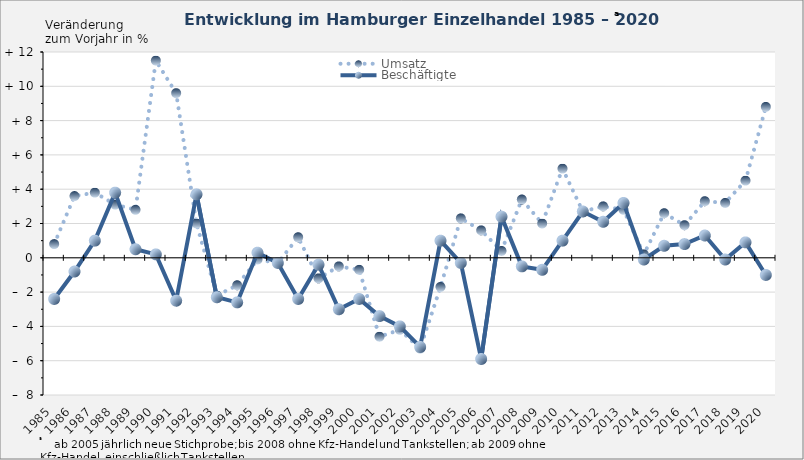
| Category | Umsatz | Beschäftigte |
|---|---|---|
| 1985.0 | 0.8 | -2.4 |
| 1986.0 | 3.6 | -0.8 |
| 1987.0 | 3.8 | 1 |
| 1988.0 | 3.1 | 3.8 |
| 1989.0 | 2.8 | 0.5 |
| 1990.0 | 11.5 | 0.2 |
| 1991.0 | 9.6 | -2.5 |
| 1992.0 | 2 | 3.7 |
| 1993.0 | -2.2 | -2.3 |
| 1994.0 | -1.6 | -2.6 |
| 1995.0 | -0.1 | 0.3 |
| 1996.0 | -0.3 | -0.3 |
| 1997.0 | 1.2 | -2.4 |
| 1998.0 | -1.2 | -0.4 |
| 1999.0 | -0.5 | -3 |
| 2000.0 | -0.7 | -2.4 |
| 2001.0 | -4.6 | -3.4 |
| 2002.0 | -4.2 | -4 |
| 2003.0 | -5.3 | -5.2 |
| 2004.0 | -1.7 | 1 |
| 2005.0 | 2.3 | -0.3 |
| 2006.0 | 1.6 | -5.9 |
| 2007.0 | 0.4 | 2.4 |
| 2008.0 | 3.4 | -0.5 |
| 2009.0 | 2 | -0.7 |
| 2010.0 | 5.2 | 1 |
| 2011.0 | 2.7 | 2.7 |
| 2012.0 | 3 | 2.1 |
| 2013.0 | 2.8 | 3.2 |
| 2014.0 | 0.2 | -0.1 |
| 2015.0 | 2.6 | 0.7 |
| 2016.0 | 1.9 | 0.8 |
| 2017.0 | 3.3 | 1.3 |
| 2018.0 | 3.2 | -0.1 |
| 2019.0 | 4.5 | 0.9 |
| 2020.0 | 8.8 | -1 |